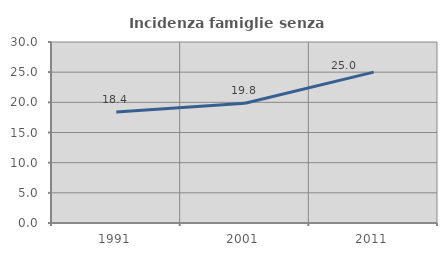
| Category | Incidenza famiglie senza nuclei |
|---|---|
| 1991.0 | 18.405 |
| 2001.0 | 19.846 |
| 2011.0 | 25 |